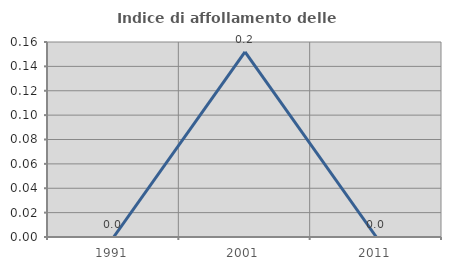
| Category | Indice di affollamento delle abitazioni  |
|---|---|
| 1991.0 | 0 |
| 2001.0 | 0.152 |
| 2011.0 | 0 |